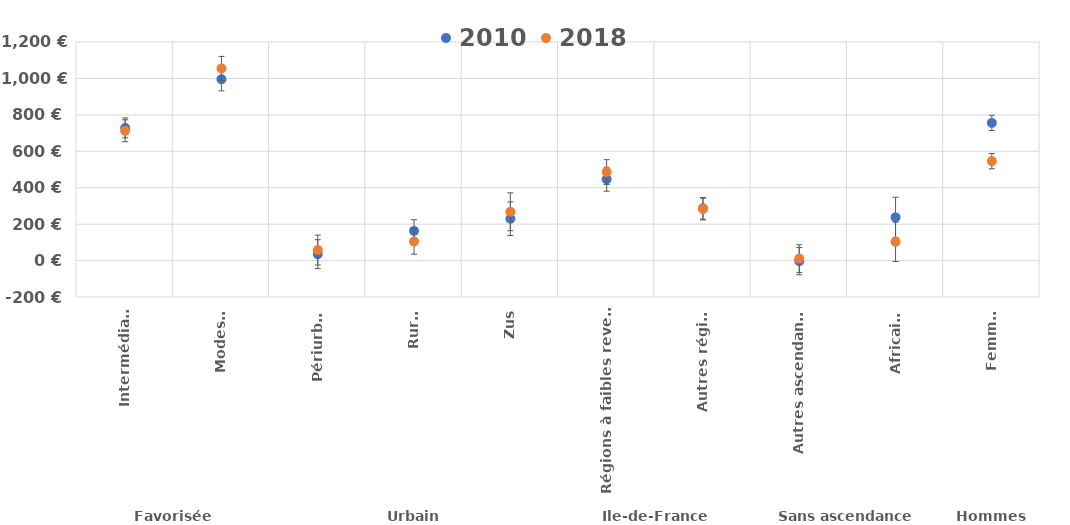
| Category | 2010 | 2018 |
|---|---|---|
| 0 | 728.2 | 713 |
| 1 | 995.5 | 1055 |
| 2 | 35.2 | 58 |
| 3 | 162.8 | 105 |
| 4 | 229.9 | 268 |
| 5 | 446.6 | 486 |
| 6 | 287.1 | 283 |
| 7 | -3.3 | 11 |
| 8 | 237.6 | 103 |
| 9 | 755.7 | 546 |